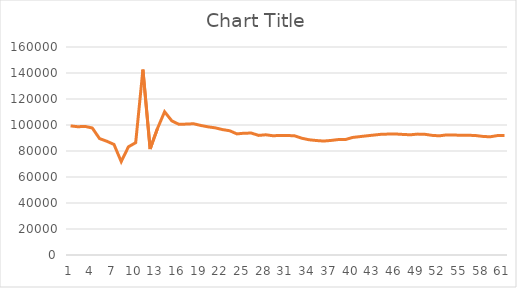
| Category | Series 1 |
|---|---|
| 0 | 99306.5 |
| 1 | 98671.4 |
| 2 | 98918.2 |
| 3 | 97699.2 |
| 4 | 89560.8 |
| 5 | 87507.9 |
| 6 | 85038.1 |
| 7 | 71841 |
| 8 | 83238.3 |
| 9 | 86395.6 |
| 10 | 142669 |
| 11 | 81539.3 |
| 12 | 97113.3 |
| 13 | 110191 |
| 14 | 103153 |
| 15 | 100478 |
| 16 | 100707 |
| 17 | 100965 |
| 18 | 99658.2 |
| 19 | 98607.7 |
| 20 | 97817.9 |
| 21 | 96479.9 |
| 22 | 95584.1 |
| 23 | 93155 |
| 24 | 93692 |
| 25 | 93793.3 |
| 26 | 91993.5 |
| 27 | 92470.6 |
| 28 | 91727.7 |
| 29 | 91994.5 |
| 30 | 91944.7 |
| 31 | 91651.3 |
| 32 | 89778.1 |
| 33 | 88629.2 |
| 34 | 88055.5 |
| 35 | 87655.8 |
| 36 | 88115.1 |
| 37 | 88778.2 |
| 38 | 88789.2 |
| 39 | 90419.1 |
| 40 | 91060.2 |
| 41 | 91693.7 |
| 42 | 92288.6 |
| 43 | 92874.6 |
| 44 | 93018.5 |
| 45 | 93068.7 |
| 46 | 92731.8 |
| 47 | 92474.8 |
| 48 | 92989.7 |
| 49 | 92851.8 |
| 50 | 92029.8 |
| 51 | 91671.6 |
| 52 | 92369 |
| 53 | 92321.2 |
| 54 | 92043.8 |
| 55 | 92104.1 |
| 56 | 91909.6 |
| 57 | 91231.6 |
| 58 | 90912.3 |
| 59 | 91842.4 |
| 60 | 91843.4 |